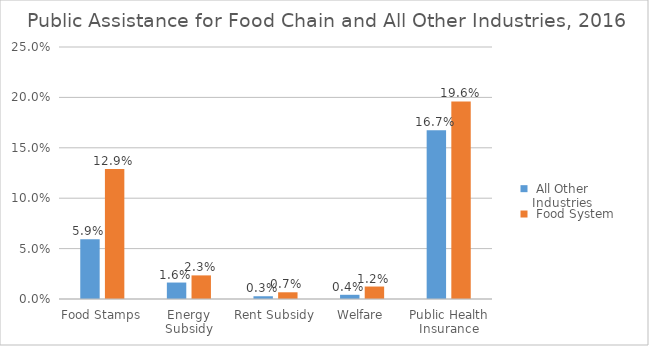
| Category | Series 0 | Series 1 |
|---|---|---|
| Food Stamps | 0.059 | 0.129 |
| Energy Subsidy | 0.016 | 0.023 |
| Rent Subsidy | 0.003 | 0.007 |
| Welfare | 0.004 | 0.012 |
| Public Health Insurance | 0.167 | 0.196 |